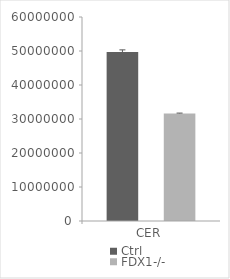
| Category | Ctrl | FDX1-/- |
|---|---|---|
| CER | 49679983.117 | 31639948.502 |